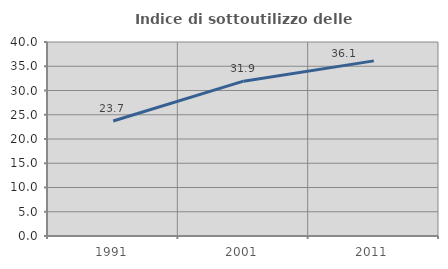
| Category | Indice di sottoutilizzo delle abitazioni  |
|---|---|
| 1991.0 | 23.719 |
| 2001.0 | 31.924 |
| 2011.0 | 36.109 |